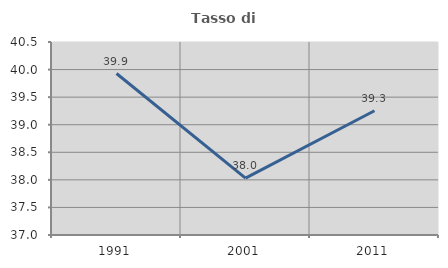
| Category | Tasso di occupazione   |
|---|---|
| 1991.0 | 39.928 |
| 2001.0 | 38.031 |
| 2011.0 | 39.253 |